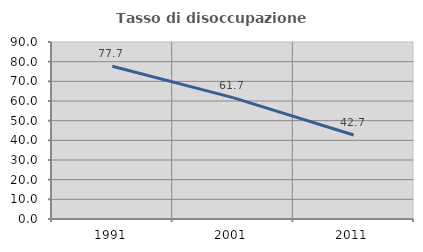
| Category | Tasso di disoccupazione giovanile  |
|---|---|
| 1991.0 | 77.654 |
| 2001.0 | 61.719 |
| 2011.0 | 42.718 |